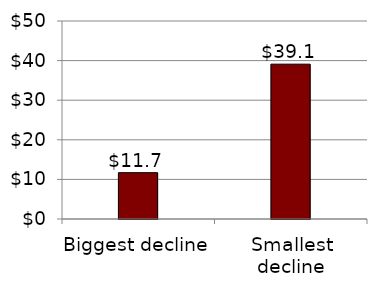
| Category | Series 0 |
|---|---|
| Biggest decline | 11.7 |
| Smallest decline | 39.1 |